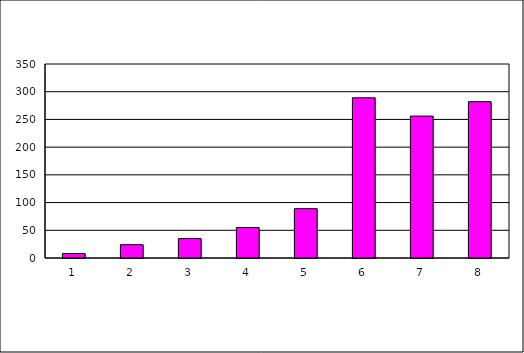
| Category | Series 0 |
|---|---|
| 0 | 8 |
| 1 | 24 |
| 2 | 35 |
| 3 | 55 |
| 4 | 89 |
| 5 | 289 |
| 6 | 256 |
| 7 | 282 |